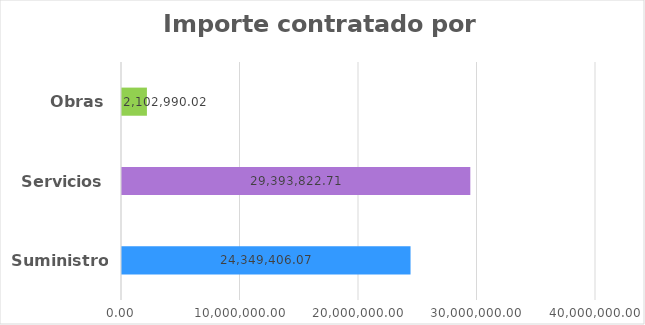
| Category | Series 0 |
|---|---|
| Suministros | 24349406.07 |
| Servicios | 29393822.71 |
| Obras | 2102990.02 |